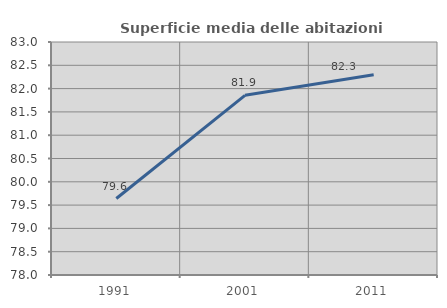
| Category | Superficie media delle abitazioni occupate |
|---|---|
| 1991.0 | 79.641 |
| 2001.0 | 81.856 |
| 2011.0 | 82.299 |